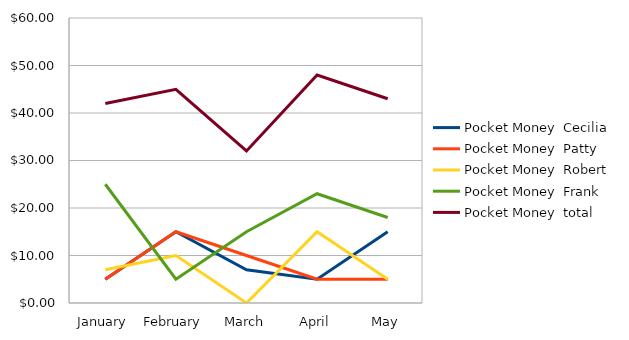
| Category | Pocket Money |
|---|---|
| January | 42 |
| February | 45 |
| March | 32 |
| April | 48 |
| May | 43 |